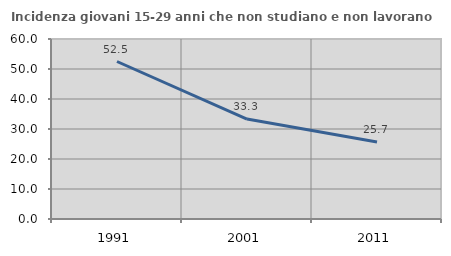
| Category | Incidenza giovani 15-29 anni che non studiano e non lavorano  |
|---|---|
| 1991.0 | 52.5 |
| 2001.0 | 33.312 |
| 2011.0 | 25.658 |